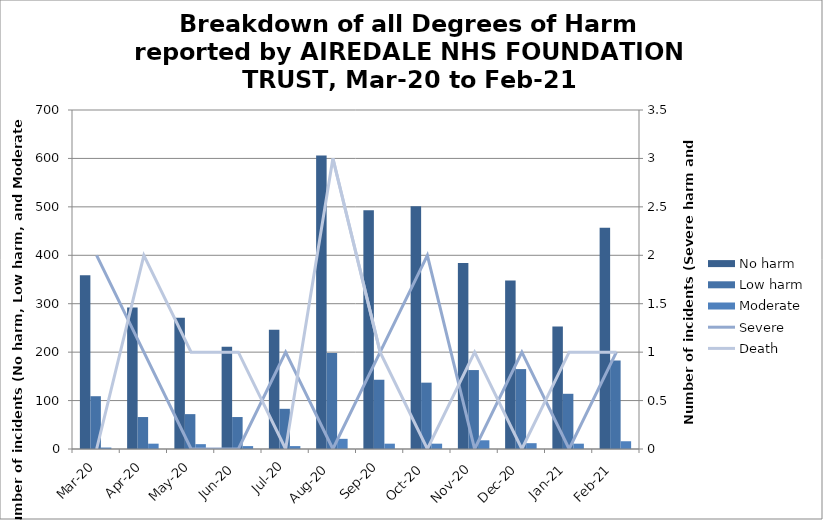
| Category | No harm | Low harm | Moderate |
|---|---|---|---|
| Mar-20 | 359 | 109 | 3 |
| Apr-20 | 292 | 66 | 11 |
| May-20 | 271 | 72 | 10 |
| Jun-20 | 211 | 66 | 6 |
| Jul-20 | 246 | 83 | 6 |
| Aug-20 | 606 | 198 | 21 |
| Sep-20 | 493 | 143 | 11 |
| Oct-20 | 501 | 137 | 11 |
| Nov-20 | 384 | 163 | 18 |
| Dec-20 | 348 | 165 | 12 |
| Jan-21 | 253 | 114 | 11 |
| Feb-21 | 457 | 183 | 16 |